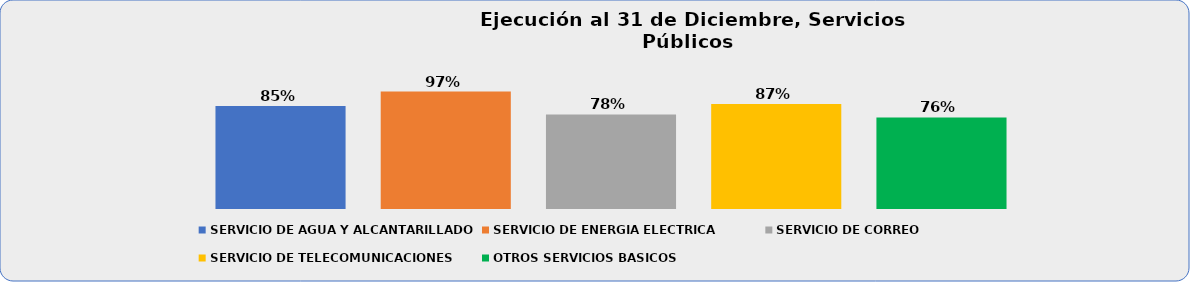
| Category | SERVICIO DE AGUA Y ALCANTARILLADO | SERVICIO DE ENERGIA ELECTRICA | SERVICIO DE CORREO | SERVICIO DE TELECOMUNICACIONES | OTROS SERVICIOS BASICOS |
|---|---|---|---|---|---|
| 0 | 0.852 | 0.971 | 0.782 | 0.868 | 0.758 |